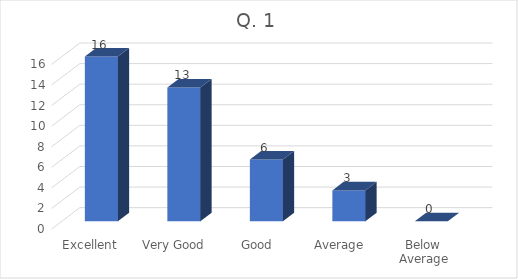
| Category | Series 0 |
|---|---|
| Excellent  | 16 |
| Very Good | 13 |
| Good | 6 |
| Average | 3 |
| Below Average | 0 |